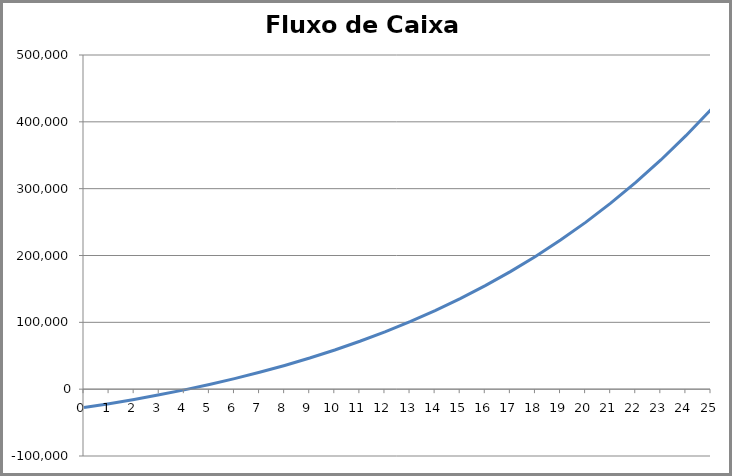
| Category | Fluxo de Caixa Acumulado |
|---|---|
| 0.0 | -27500 |
| 1.0 | -21667.13 |
| 2.0 | -15340.622 |
| 3.0 | -8480.14 |
| 4.0 | -1042.105 |
| 5.0 | 7020.565 |
| 6.0 | 15758.729 |
| 7.0 | 25227.328 |
| 8.0 | 35485.709 |
| 9.0 | 46597.976 |
| 10.0 | 58633.37 |
| 11.0 | 71666.677 |
| 12.0 | 85778.667 |
| 13.0 | 101056.575 |
| 14.0 | 117594.61 |
| 15.0 | 135494.515 |
| 16.0 | 154866.162 |
| 17.0 | 175828.2 |
| 18.0 | 198508.753 |
| 19.0 | 223046.173 |
| 20.0 | 249589.85 |
| 21.0 | 278301.093 |
| 22.0 | 309354.076 |
| 23.0 | 342936.857 |
| 24.0 | 379252.484 |
| 25.0 | 418520.183 |